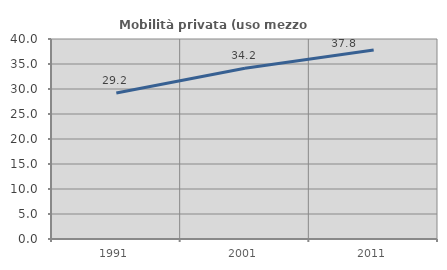
| Category | Mobilità privata (uso mezzo privato) |
|---|---|
| 1991.0 | 29.206 |
| 2001.0 | 34.159 |
| 2011.0 | 37.795 |